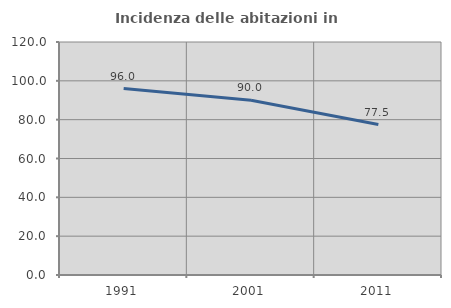
| Category | Incidenza delle abitazioni in proprietà  |
|---|---|
| 1991.0 | 95.992 |
| 2001.0 | 90 |
| 2011.0 | 77.488 |